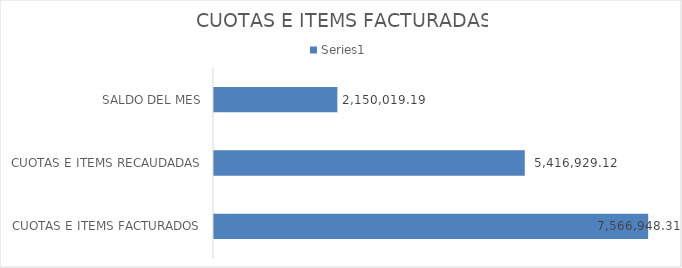
| Category | Series 0 |
|---|---|
| CUOTAS E ITEMS FACTURADOS | 7566948.31 |
| CUOTAS E ITEMS RECAUDADAS | 5416929.12 |
| SALDO DEL MES | 2150019.19 |